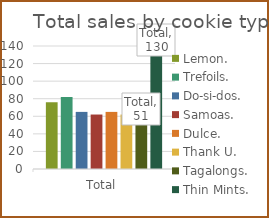
| Category | Lemon. | Trefoils. | Do-si-dos. | Samoas. | Dulce. | Thank U. | Tagalongs. | Thin Mints. |
|---|---|---|---|---|---|---|---|---|
| Total | 76 | 82 | 65 | 62 | 65 | 62 | 51 | 130 |